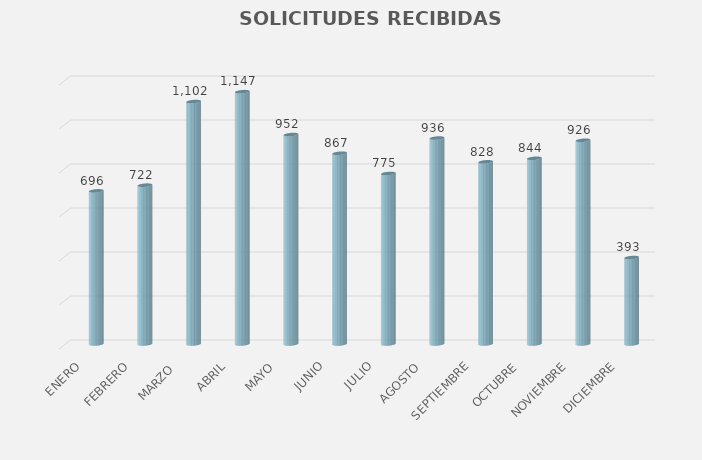
| Category | Series 0 | Series 1 |
|---|---|---|
| ENERO |  | 696 |
| FEBRERO |  | 722 |
| MARZO  |  | 1102 |
| ABRIL |  | 1147 |
| MAYO |  | 952 |
| JUNIO |  | 867 |
| JULIO |  | 775 |
| AGOSTO |  | 936 |
| SEPTIEMBRE |  | 828 |
| OCTUBRE |  | 844 |
| NOVIEMBRE |  | 926 |
| DICIEMBRE |  | 393 |